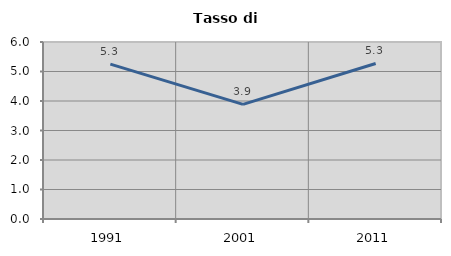
| Category | Tasso di disoccupazione   |
|---|---|
| 1991.0 | 5.251 |
| 2001.0 | 3.887 |
| 2011.0 | 5.272 |